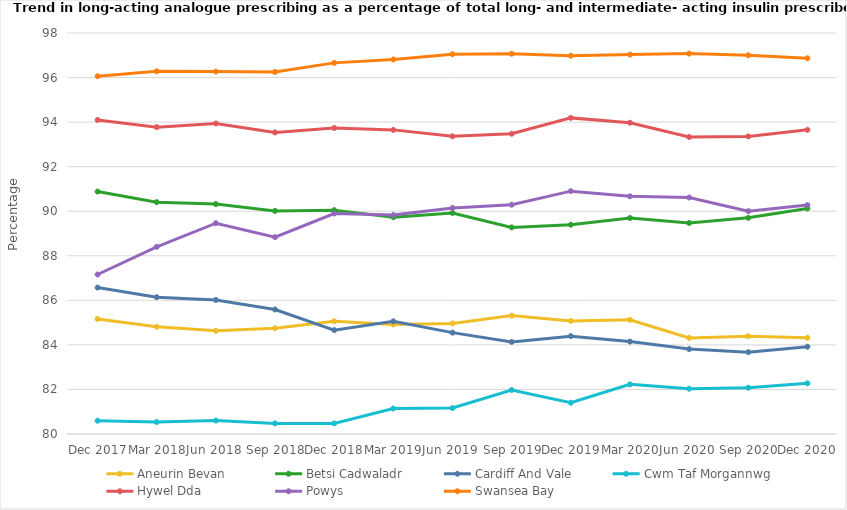
| Category | Aneurin Bevan | Betsi Cadwaladr | Cardiff And Vale | Cwm Taf Morgannwg | Hywel Dda | Powys | Swansea Bay |
|---|---|---|---|---|---|---|---|
| Dec 2017 | 85.165 | 90.883 | 86.574 | 80.596 | 94.097 | 87.16 | 96.06 |
| Mar 2018 | 84.814 | 90.407 | 86.14 | 80.537 | 93.774 | 88.403 | 96.281 |
| Jun 2018 | 84.634 | 90.319 | 86.018 | 80.604 | 93.938 | 89.462 | 96.269 |
| Sep 2018 | 84.748 | 90.014 | 85.59 | 80.476 | 93.538 | 88.835 | 96.249 |
| Dec 2018 | 85.063 | 90.048 | 84.663 | 80.474 | 93.735 | 89.898 | 96.659 |
| Mar 2019 | 84.915 | 89.731 | 85.057 | 81.144 | 93.651 | 89.831 | 96.813 |
| Jun 2019 | 84.964 | 89.922 | 84.55 | 81.165 | 93.362 | 90.149 | 97.048 |
| Sep 2019 | 85.316 | 89.274 | 84.133 | 81.975 | 93.477 | 90.292 | 97.069 |
| Dec 2019 | 85.074 | 89.394 | 84.393 | 81.403 | 94.19 | 90.901 | 96.98 |
| Mar 2020 | 85.124 | 89.697 | 84.148 | 82.228 | 93.973 | 90.669 | 97.03 |
| Jun 2020 | 84.314 | 89.473 | 83.812 | 82.03 | 93.331 | 90.617 | 97.076 |
| Sep 2020 | 84.388 | 89.703 | 83.673 | 82.078 | 93.357 | 90.004 | 97.001 |
| Dec 2020 | 84.32 | 90.124 | 83.916 | 82.274 | 93.653 | 90.275 | 96.866 |